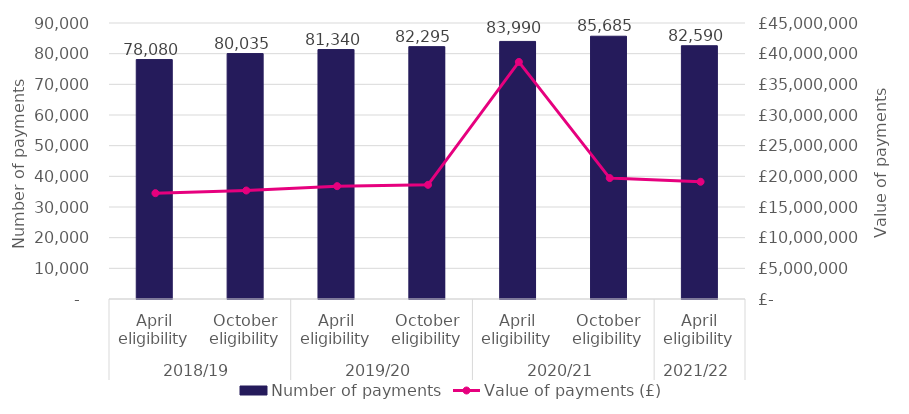
| Category | Number of payments |
|---|---|
| 0 | 78080 |
| 1 | 80035 |
| 2 | 81340 |
| 3 | 82295 |
| 4 | 83990 |
| 5 | 85685 |
| 6 | 82590 |